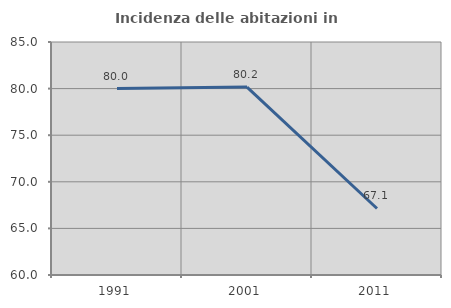
| Category | Incidenza delle abitazioni in proprietà  |
|---|---|
| 1991.0 | 80 |
| 2001.0 | 80.164 |
| 2011.0 | 67.136 |